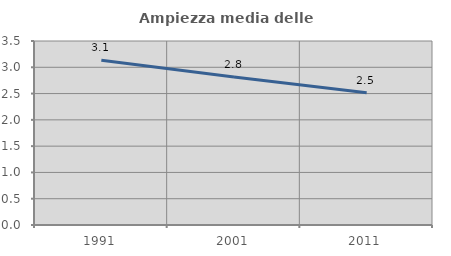
| Category | Ampiezza media delle famiglie |
|---|---|
| 1991.0 | 3.136 |
| 2001.0 | 2.817 |
| 2011.0 | 2.516 |